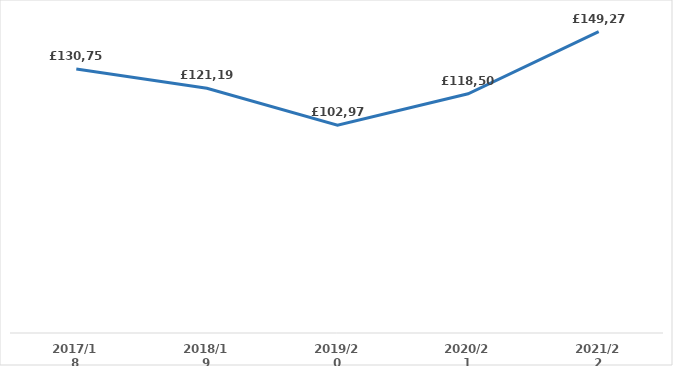
| Category | Series 0 |
|---|---|
| 2017/18 | 130753.23 |
| 2018/19 | 121194.121 |
| 2019/20 | 102972.87 |
| 2020/21 | 118500.65 |
| 2021/22 | 149278.98 |